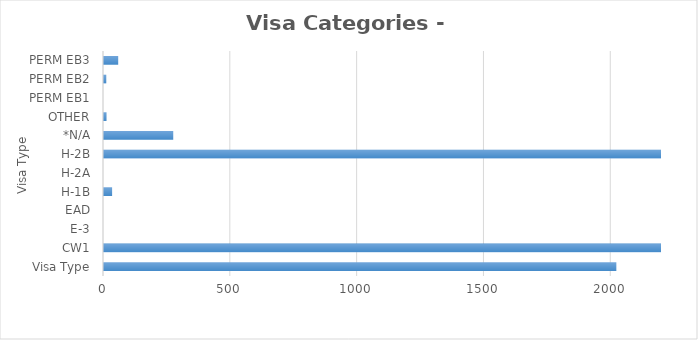
| Category | Series 0 |
|---|---|
| Visa Type | 2020 |
| CW1 | 17163 |
| E-3 | 0 |
| EAD | 0 |
| H-1B | 32 |
| H-2A | 0 |
| H-2B | 3445 |
| *N/A | 273 |
| OTHER | 10 |
| PERM EB1 | 0 |
| PERM EB2 | 9 |
| PERM EB3 | 56 |